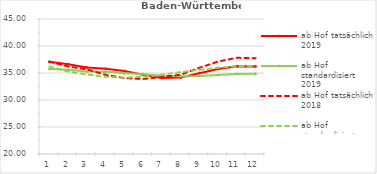
| Category | ab Hof tatsächlich 2019 | ab Hof standardisiert 2019 | ab Hof tatsächlich 2018 | ab Hof standardisiert 2018 |
|---|---|---|---|---|
| 0 | 37.075 | 35.739 | 37.082 | 36.21 |
| 1 | 36.629 | 35.584 | 36.217 | 35.273 |
| 2 | 36.017 | 35.268 | 35.677 | 34.726 |
| 3 | 35.8 | 35.224 | 34.662 | 34.306 |
| 4 | 35.351 | 34.935 | 34.055 | 34.132 |
| 5 | 34.662 | 34.798 | 33.889 | 34.306 |
| 6 | 34.073 | 34.486 | 34.252 | 34.671 |
| 7 | 34.144 | 34.383 | 34.69 | 35.171 |
| 8 | 34.955 | 34.464 | 35.964 | 35.581 |
| 9 | 35.749 | 34.626 | 37.132 | 35.97 |
| 10 | 36.264 | 34.831 | 37.812 | 36.276 |
| 11 | 36.216 | 34.842 | 37.743 | 36.317 |